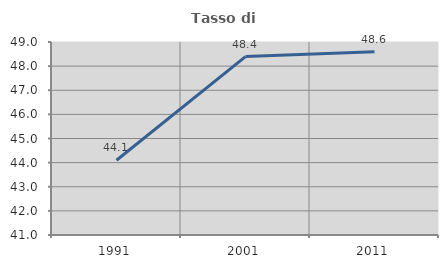
| Category | Tasso di occupazione   |
|---|---|
| 1991.0 | 44.1 |
| 2001.0 | 48.396 |
| 2011.0 | 48.598 |